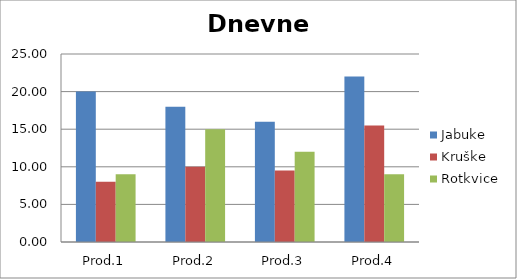
| Category | Jabuke | Kruške | Rotkvice |
|---|---|---|---|
| Prod.1 | 20 | 8 | 9 |
| Prod.2 | 18 | 10 | 15 |
| Prod.3 | 16 | 9.5 | 12 |
| Prod.4 | 22 | 15.5 | 9 |